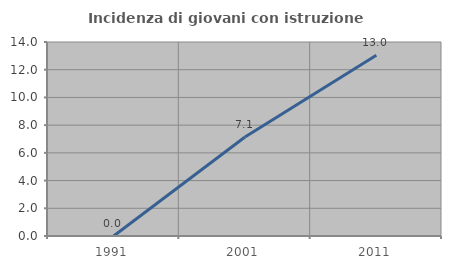
| Category | Incidenza di giovani con istruzione universitaria |
|---|---|
| 1991.0 | 0 |
| 2001.0 | 7.143 |
| 2011.0 | 13.043 |